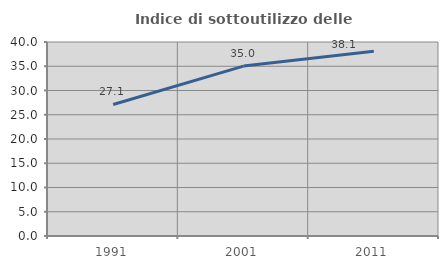
| Category | Indice di sottoutilizzo delle abitazioni  |
|---|---|
| 1991.0 | 27.119 |
| 2001.0 | 35.036 |
| 2011.0 | 38.095 |